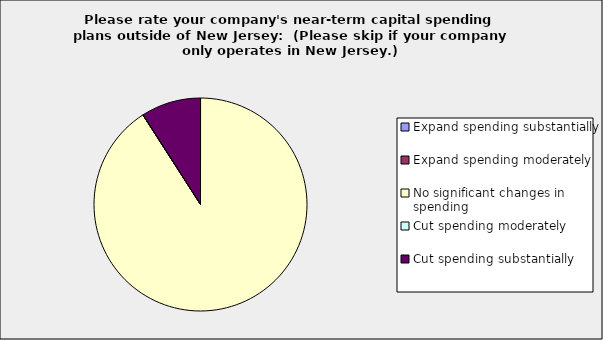
| Category | Series 0 |
|---|---|
| Expand spending substantially | 0 |
| Expand spending moderately | 0 |
| No significant changes in spending | 0.909 |
| Cut spending moderately | 0 |
| Cut spending substantially | 0.091 |